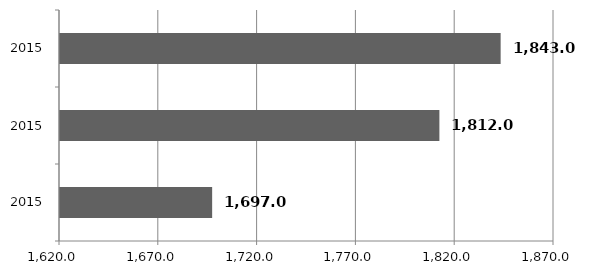
| Category | Series 0 |
|---|---|
| 2015.0 | 1697 |
| 2015.0 | 1812 |
| 2015.0 | 1843 |